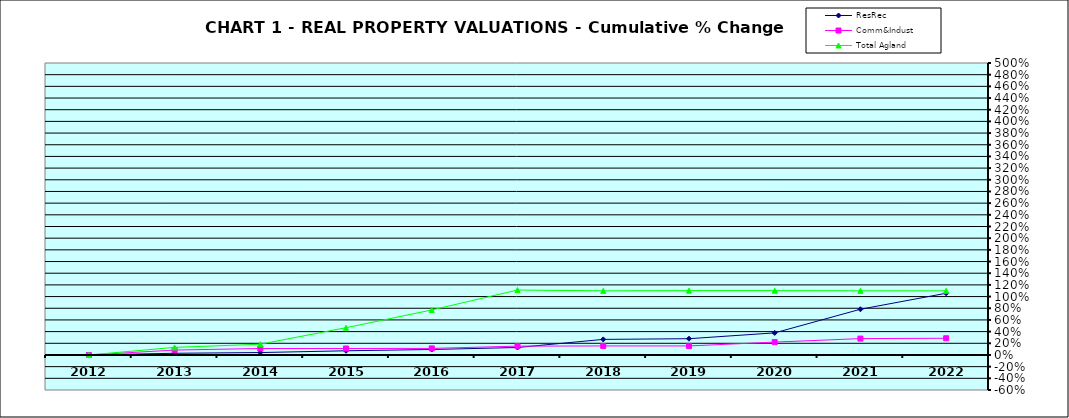
| Category | ResRec | Comm&Indust | Total Agland |
|---|---|---|---|
| 2012.0 | 0 | 0 | 0 |
| 2013.0 | 0.029 | 0.084 | 0.129 |
| 2014.0 | 0.041 | 0.111 | 0.184 |
| 2015.0 | 0.071 | 0.111 | 0.467 |
| 2016.0 | 0.094 | 0.113 | 0.77 |
| 2017.0 | 0.128 | 0.151 | 1.112 |
| 2018.0 | 0.267 | 0.154 | 1.098 |
| 2019.0 | 0.279 | 0.154 | 1.102 |
| 2020.0 | 0.378 | 0.22 | 1.102 |
| 2021.0 | 0.783 | 0.28 | 1.099 |
| 2022.0 | 1.057 | 0.286 | 1.098 |